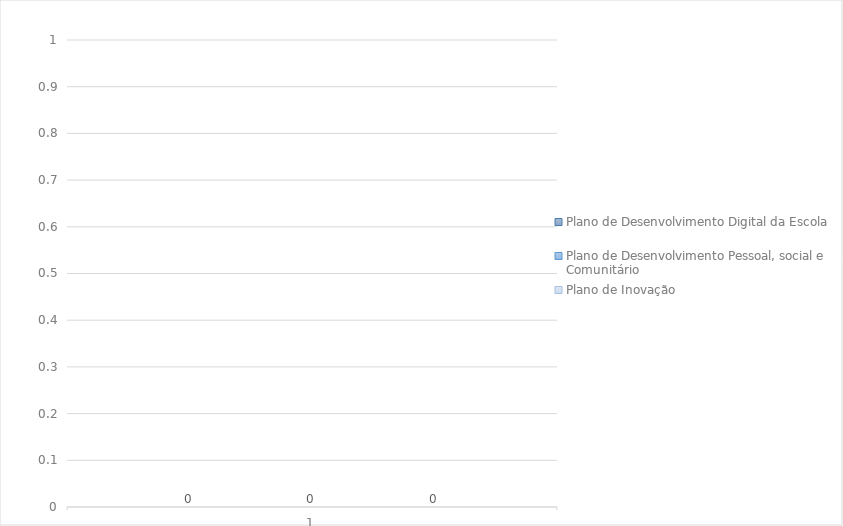
| Category | Plano de Desenvolvimento Digital da Escola | Plano de Desenvolvimento Pessoal, social e Comunitário | Plano de Inovação |
|---|---|---|---|
| 0 | 0 | 0 | 0 |